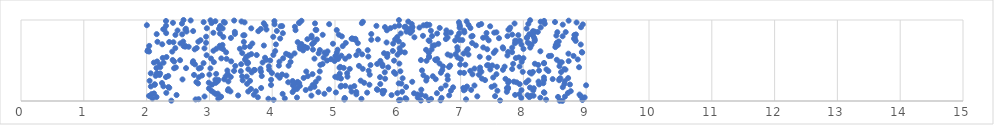
| Category | Series 0 |
|---|---|
| 8.620334740561397 | 0.001 |
| 8.577781063978271 | 0.003 |
| 2.394129611794839 | 0.004 |
| 6.367116884352891 | 0.006 |
| 7.628746824519194 | 0.007 |
| 6.680696197095411 | 0.008 |
| 6.0182350392369175 | 0.01 |
| 6.494375814497979 | 0.011 |
| 8.939752977108713 | 0.013 |
| 6.038626159554214 | 0.014 |
| 4.0221696450401705 | 0.015 |
| 8.36124268354945 | 0.017 |
| 5.149115118206559 | 0.018 |
| 2.780681563461558 | 0.02 |
| 7.086586834998346 | 0.021 |
| 2.82830336923716 | 0.022 |
| 6.135725208126665 | 0.024 |
| 6.529994858500692 | 0.025 |
| 5.421172009272322 | 0.026 |
| 3.9399875411051037 | 0.028 |
| 3.1417226934743816 | 0.029 |
| 2.0935191159519415 | 0.031 |
| 4.200688805081899 | 0.032 |
| 5.157020477372738 | 0.033 |
| 6.121508024751515 | 0.035 |
| 5.154020457620649 | 0.036 |
| 7.96602483923554 | 0.038 |
| 6.698022358880593 | 0.039 |
| 8.26959194742168 | 0.04 |
| 6.317431436418376 | 0.042 |
| 4.394443002276267 | 0.043 |
| 8.975484957480315 | 0.045 |
| 3.771585918920084 | 0.046 |
| 8.093873283273606 | 0.047 |
| 2.1581239671881383 | 0.049 |
| 8.551694796909633 | 0.05 |
| 3.1783726633881058 | 0.052 |
| 3.1855228534734934 | 0.053 |
| 8.661343083831905 | 0.054 |
| 2.9224018196007653 | 0.056 |
| 7.265581514534332 | 0.057 |
| 6.441491807775577 | 0.059 |
| 7.548647643515576 | 0.06 |
| 8.912007410644422 | 0.061 |
| 2.0382421870141894 | 0.063 |
| 8.12089670831112 | 0.064 |
| 8.161868215036687 | 0.066 |
| 4.624342285559006 | 0.067 |
| 3.4579888722409384 | 0.068 |
| 6.817817682467866 | 0.07 |
| 8.06594473842435 | 0.071 |
| 5.900421587838842 | 0.073 |
| 2.477007553058457 | 0.074 |
| 7.867908435245571 | 0.075 |
| 3.7076346270599654 | 0.077 |
| 6.371708374958117 | 0.078 |
| 8.893988422071315 | 0.079 |
| 6.314305421941711 | 0.081 |
| 5.339979780789223 | 0.082 |
| 7.935927694832709 | 0.084 |
| 2.080248321402492 | 0.085 |
| 3.102141303672091 | 0.086 |
| 4.166225096903844 | 0.088 |
| 4.831019658294338 | 0.089 |
| 3.1333976846445175 | 0.091 |
| 5.761507799481672 | 0.092 |
| 2.1185464060351173 | 0.093 |
| 6.25847755851577 | 0.095 |
| 6.622464147850438 | 0.096 |
| 5.992118365913914 | 0.098 |
| 8.709469036508903 | 0.099 |
| 2.31390816328849 | 0.1 |
| 8.334138534038694 | 0.102 |
| 5.511827417850529 | 0.103 |
| 3.067149837540377 | 0.105 |
| 5.014468910864612 | 0.106 |
| 8.326885987061788 | 0.107 |
| 4.7348156235051775 | 0.109 |
| 4.324954670473176 | 0.11 |
| 5.338746026796757 | 0.112 |
| 7.736128566430616 | 0.113 |
| 6.068847741583221 | 0.114 |
| 5.264342235443349 | 0.116 |
| 3.6180632176365313 | 0.117 |
| 3.33515913851461 | 0.119 |
| 3.7400972610486805 | 0.12 |
| 8.753925341187738 | 0.121 |
| 5.751686463864311 | 0.123 |
| 5.784313105735203 | 0.124 |
| 3.031973449589434 | 0.126 |
| 7.586048773269678 | 0.127 |
| 6.846116851391246 | 0.128 |
| 3.294668362935326 | 0.13 |
| 8.156151926477396 | 0.131 |
| 7.0515330906881255 | 0.132 |
| 7.969359191170405 | 0.134 |
| 4.533929907262074 | 0.135 |
| 7.168046548339563 | 0.137 |
| 5.675308210907399 | 0.138 |
| 6.374173429319274 | 0.139 |
| 4.353616781089704 | 0.141 |
| 7.068182818923401 | 0.142 |
| 4.904569993495854 | 0.144 |
| 5.667646251854268 | 0.145 |
| 3.301755577856441 | 0.146 |
| 3.661625587687106 | 0.148 |
| 4.395780241051994 | 0.149 |
| 7.755298526900773 | 0.151 |
| 4.359294629269337 | 0.152 |
| 6.688547719138859 | 0.153 |
| 2.992284067040303 | 0.155 |
| 4.608864252538719 | 0.156 |
| 8.165045972294058 | 0.158 |
| 7.736883620469168 | 0.159 |
| 3.824126002981173 | 0.16 |
| 7.043984929636865 | 0.162 |
| 2.3609790268477164 | 0.163 |
| 7.755250939481829 | 0.165 |
| 8.10440093037882 | 0.166 |
| 5.247088261994797 | 0.167 |
| 6.880652807361724 | 0.169 |
| 8.62681686267085 | 0.17 |
| 2.348155028301093 | 0.172 |
| 6.132225335017425 | 0.173 |
| 7.49388413491942 | 0.174 |
| 4.671837880973394 | 0.176 |
| 5.089523878336838 | 0.177 |
| 7.10144382525517 | 0.179 |
| 2.067397789355227 | 0.18 |
| 2.2679657403912676 | 0.181 |
| 4.665551521192633 | 0.183 |
| 5.307582962681378 | 0.184 |
| 4.439659909656607 | 0.185 |
| 5.163193394501674 | 0.187 |
| 5.0987165360337965 | 0.188 |
| 7.53992506310093 | 0.19 |
| 7.220708743274301 | 0.191 |
| 6.761642891512213 | 0.192 |
| 8.998310135500535 | 0.194 |
| 4.32847311676495 | 0.195 |
| 4.643649716206369 | 0.197 |
| 3.981324359384705 | 0.198 |
| 2.127982691667706 | 0.199 |
| 5.548304375840037 | 0.201 |
| 3.0434532756628583 | 0.202 |
| 8.74104309252086 | 0.204 |
| 8.251007837546165 | 0.205 |
| 2.1310251748720983 | 0.206 |
| 7.94144802617223 | 0.208 |
| 5.721280811588738 | 0.209 |
| 8.653722630080274 | 0.211 |
| 3.6003542244516824 | 0.212 |
| 4.37407635934352 | 0.213 |
| 6.056395641203517 | 0.215 |
| 2.819407067253628 | 0.216 |
| 6.014594385633039 | 0.218 |
| 8.317511186979411 | 0.219 |
| 4.429862278746077 | 0.22 |
| 2.245171579689807 | 0.222 |
| 3.0994218851231077 | 0.223 |
| 5.464113123875528 | 0.225 |
| 2.9898442183064367 | 0.226 |
| 7.756750798366252 | 0.227 |
| 8.042936577896054 | 0.229 |
| 7.893613061361598 | 0.23 |
| 4.255350412334257 | 0.232 |
| 2.7927124223012743 | 0.233 |
| 4.692966219793615 | 0.234 |
| 4.406285371015967 | 0.236 |
| 6.229664019301289 | 0.237 |
| 7.8487163905028305 | 0.238 |
| 8.241047454991406 | 0.24 |
| 3.301576266974131 | 0.241 |
| 3.1305462797666657 | 0.243 |
| 8.657782304960795 | 0.244 |
| 7.7673642906774525 | 0.245 |
| 4.325992628745898 | 0.247 |
| 3.646732672734283 | 0.248 |
| 2.0479323924500776 | 0.25 |
| 5.409477848767041 | 0.251 |
| 6.45336829436801 | 0.252 |
| 8.079477831281544 | 0.254 |
| 3.530016634358503 | 0.255 |
| 8.569569628891657 | 0.257 |
| 7.389718221654414 | 0.258 |
| 8.328198960639043 | 0.259 |
| 3.142097861045819 | 0.261 |
| 3.9822140932649375 | 0.262 |
| 3.0950273456595427 | 0.264 |
| 6.795297226545601 | 0.265 |
| 2.571533173613245 | 0.266 |
| 3.235690021085294 | 0.268 |
| 6.603680042797346 | 0.269 |
| 8.466812996970264 | 0.271 |
| 8.573147233176808 | 0.272 |
| 7.714591806620703 | 0.273 |
| 5.79811897905985 | 0.275 |
| 7.3395427082960065 | 0.276 |
| 5.09486512981708 | 0.278 |
| 4.739291857579742 | 0.279 |
| 6.076905409188501 | 0.28 |
| 8.588686329437465 | 0.282 |
| 8.712441523283601 | 0.283 |
| 4.501168894721407 | 0.285 |
| 6.463415149616182 | 0.286 |
| 4.1194688852757455 | 0.287 |
| 5.045087589869803 | 0.289 |
| 7.519504833309577 | 0.29 |
| 8.326988255419288 | 0.291 |
| 2.830762448349465 | 0.293 |
| 5.717085970194961 | 0.294 |
| 2.3085513192408076 | 0.296 |
| 3.34000165499681 | 0.297 |
| 5.004234574926601 | 0.298 |
| 5.1984226812590215 | 0.3 |
| 3.594150168755199 | 0.301 |
| 3.258439250257056 | 0.303 |
| 3.5216033574599983 | 0.304 |
| 6.557749552927165 | 0.305 |
| 4.5672798455573975 | 0.307 |
| 3.833489999593424 | 0.308 |
| 2.344848900731992 | 0.31 |
| 2.144281194732572 | 0.311 |
| 6.790992336447414 | 0.312 |
| 4.226133122997952 | 0.314 |
| 2.882722209854035 | 0.315 |
| 4.083648737790945 | 0.317 |
| 6.408275507408994 | 0.318 |
| 5.065569416685895 | 0.319 |
| 2.205155097834016 | 0.321 |
| 2.75529172518958 | 0.322 |
| 7.292103075053982 | 0.324 |
| 5.552659255794133 | 0.325 |
| 2.999659274692581 | 0.326 |
| 4.158145246237067 | 0.328 |
| 7.1894962357559855 | 0.329 |
| 7.570595830621945 | 0.331 |
| 4.642483412831448 | 0.332 |
| 3.2919753915087324 | 0.333 |
| 3.1078873156430644 | 0.335 |
| 5.9625259445807135 | 0.336 |
| 5.075850176349863 | 0.338 |
| 8.129263020818119 | 0.339 |
| 2.215595928039105 | 0.34 |
| 2.0661597143934785 | 0.342 |
| 5.193397973154988 | 0.343 |
| 2.164865517327838 | 0.344 |
| 3.995586978359274 | 0.346 |
| 7.054406683918627 | 0.347 |
| 6.68590934342507 | 0.349 |
| 6.991428618320853 | 0.35 |
| 8.101733729228194 | 0.351 |
| 3.673824181933775 | 0.353 |
| 5.7929338201949765 | 0.354 |
| 5.939522970302994 | 0.356 |
| 8.60008170739517 | 0.357 |
| 8.151392512686577 | 0.358 |
| 7.989449197010353 | 0.36 |
| 7.3309346650769225 | 0.361 |
| 3.82177528115448 | 0.363 |
| 4.542730236084017 | 0.364 |
| 4.756802381668503 | 0.365 |
| 6.040867127518111 | 0.367 |
| 3.500461901464748 | 0.368 |
| 8.397234639392773 | 0.37 |
| 3.392617332543344 | 0.371 |
| 7.153279141530445 | 0.372 |
| 5.535846188563598 | 0.374 |
| 8.24905426758135 | 0.375 |
| 3.2860847382399982 | 0.377 |
| 6.385288972781698 | 0.378 |
| 7.309659957949908 | 0.379 |
| 6.707571725050807 | 0.381 |
| 3.7232713546467013 | 0.382 |
| 3.7115269258937773 | 0.384 |
| 7.67417847365904 | 0.385 |
| 3.9523328175740566 | 0.386 |
| 8.670143864905558 | 0.388 |
| 7.473331782140614 | 0.389 |
| 8.36693882768353 | 0.391 |
| 3.6196793368350164 | 0.392 |
| 8.650897439677376 | 0.393 |
| 7.821093961717614 | 0.395 |
| 5.235193529566292 | 0.396 |
| 5.441131229159433 | 0.397 |
| 3.813357282411073 | 0.399 |
| 7.22142835089465 | 0.4 |
| 2.830489413809686 | 0.402 |
| 3.016333244331552 | 0.403 |
| 2.43784841906156 | 0.404 |
| 2.6280231165607115 | 0.406 |
| 2.156510685694267 | 0.407 |
| 5.139014908626514 | 0.409 |
| 2.8638014220249657 | 0.41 |
| 5.07198112860355 | 0.411 |
| 7.3095804317339725 | 0.413 |
| 2.4657731198375332 | 0.414 |
| 5.846926004705378 | 0.416 |
| 8.886562794754873 | 0.417 |
| 2.2181409892337864 | 0.418 |
| 6.814875930565524 | 0.42 |
| 5.0833876453680515 | 0.421 |
| 7.579200147718461 | 0.423 |
| 7.701047661365609 | 0.424 |
| 7.93980238241263 | 0.425 |
| 6.71959220051431 | 0.427 |
| 3.946820514564122 | 0.428 |
| 8.574382392047943 | 0.43 |
| 5.759200197191699 | 0.431 |
| 3.411928994337532 | 0.432 |
| 5.381697089754583 | 0.434 |
| 4.261139038706374 | 0.435 |
| 4.10651674643322 | 0.437 |
| 6.834021776822821 | 0.438 |
| 7.505466211165718 | 0.439 |
| 7.420941734698777 | 0.441 |
| 7.4418028055715535 | 0.442 |
| 5.565742842571682 | 0.444 |
| 8.23635223978123 | 0.445 |
| 4.766121340419551 | 0.446 |
| 7.075232237231541 | 0.448 |
| 2.208879257320607 | 0.449 |
| 6.992807875282049 | 0.45 |
| 2.7704339255194954 | 0.452 |
| 5.7527647148372045 | 0.453 |
| 3.5061474671538484 | 0.455 |
| 4.802144408149182 | 0.456 |
| 5.671517770989667 | 0.457 |
| 7.836659520290863 | 0.459 |
| 8.182452454275957 | 0.46 |
| 6.024653284208666 | 0.462 |
| 6.664421606138187 | 0.463 |
| 3.602075510609848 | 0.464 |
| 8.328405049224418 | 0.466 |
| 2.9071978230400575 | 0.467 |
| 8.328595351647499 | 0.469 |
| 3.6165562087665943 | 0.47 |
| 2.735884867114777 | 0.471 |
| 2.2696323362391824 | 0.473 |
| 2.1159801660951216 | 0.474 |
| 3.847193673911721 | 0.476 |
| 8.582521536721742 | 0.477 |
| 8.61028438327477 | 0.478 |
| 3.070897887551348 | 0.48 |
| 3.602891706441688 | 0.481 |
| 4.292402833027854 | 0.483 |
| 7.973121901519375 | 0.484 |
| 4.115281089768731 | 0.485 |
| 2.4395744478683903 | 0.487 |
| 2.1676866191789363 | 0.488 |
| 3.346632354920937 | 0.49 |
| 2.7408101245693124 | 0.491 |
| 8.72074942731579 | 0.492 |
| 4.994082923867589 | 0.494 |
| 5.72214922507919 | 0.495 |
| 6.457576631642732 | 0.497 |
| 5.940575088036761 | 0.498 |
| 4.873432118665203 | 0.499 |
| 3.968086188519889 | 0.501 |
| 6.608388214968276 | 0.502 |
| 2.5332461491486216 | 0.503 |
| 6.368554180297074 | 0.505 |
| 2.415434476558687 | 0.506 |
| 3.9054110917252096 | 0.508 |
| 8.53204312434594 | 0.509 |
| 6.595765832248066 | 0.51 |
| 3.566787590224805 | 0.512 |
| 8.86549235370561 | 0.513 |
| 7.004960717815031 | 0.515 |
| 4.936638010872729 | 0.516 |
| 6.627131799042346 | 0.517 |
| 5.049873636514673 | 0.519 |
| 3.273743213018228 | 0.52 |
| 5.163466157633952 | 0.522 |
| 4.6729326860424685 | 0.523 |
| 3.0261128975525082 | 0.524 |
| 3.189618704690272 | 0.526 |
| 4.17402495480843 | 0.527 |
| 8.000726734787708 | 0.529 |
| 7.8795218924240675 | 0.53 |
| 2.256426940738665 | 0.531 |
| 7.447168111192905 | 0.533 |
| 3.88590688832298 | 0.534 |
| 4.818364784772295 | 0.536 |
| 6.952833513952441 | 0.537 |
| 7.927894101946641 | 0.538 |
| 5.041587696906106 | 0.54 |
| 6.498221867893038 | 0.541 |
| 2.317160035859032 | 0.543 |
| 3.586968678692685 | 0.544 |
| 5.830791975489933 | 0.545 |
| 7.30544949212273 | 0.547 |
| 5.530318995785799 | 0.548 |
| 6.49656876086354 | 0.55 |
| 5.223367368774671 | 0.551 |
| 4.297562855897328 | 0.552 |
| 5.004914483470621 | 0.554 |
| 8.406204761878627 | 0.555 |
| 8.79850765151167 | 0.556 |
| 8.442039721589634 | 0.558 |
| 5.101264151773798 | 0.559 |
| 6.840581294807028 | 0.561 |
| 7.745540448128726 | 0.562 |
| 3.6257036395422255 | 0.563 |
| 2.9554171202997956 | 0.565 |
| 5.339260204436663 | 0.566 |
| 3.7534093143558804 | 0.568 |
| 4.018289299050387 | 0.569 |
| 4.26260085647373 | 0.57 |
| 5.995277176845484 | 0.572 |
| 7.1250101098579846 | 0.573 |
| 6.7940769732883695 | 0.575 |
| 5.432097270640233 | 0.576 |
| 6.919071567496458 | 0.577 |
| 3.6677627917965405 | 0.579 |
| 5.835922924267399 | 0.58 |
| 4.859896115484259 | 0.582 |
| 4.220874917527146 | 0.583 |
| 8.717118059456876 | 0.584 |
| 7.047559004467943 | 0.586 |
| 4.3554549584014906 | 0.587 |
| 4.740191050156976 | 0.589 |
| 5.781089690625247 | 0.59 |
| 3.522942489597081 | 0.591 |
| 6.494021190388336 | 0.593 |
| 7.528721523051351 | 0.594 |
| 5.028279489088819 | 0.596 |
| 4.832594922348788 | 0.597 |
| 8.936217029651798 | 0.598 |
| 6.111844133121123 | 0.6 |
| 3.2664700141912246 | 0.601 |
| 7.819850362732644 | 0.603 |
| 8.93092696451579 | 0.604 |
| 6.032758312096574 | 0.605 |
| 7.757301975327598 | 0.607 |
| 6.050432052953778 | 0.608 |
| 2.4086125044395867 | 0.609 |
| 2.0397705020580545 | 0.611 |
| 4.881174359578427 | 0.612 |
| 8.270374772805955 | 0.614 |
| 2.0132176975148552 | 0.615 |
| 4.047931500584588 | 0.616 |
| 5.92049562246393 | 0.618 |
| 5.375005612030904 | 0.619 |
| 3.0641547676183682 | 0.621 |
| 7.557069305402317 | 0.622 |
| 7.095832117320791 | 0.623 |
| 4.492182108738526 | 0.625 |
| 6.953274751822149 | 0.626 |
| 5.5207266124083585 | 0.628 |
| 4.758709338844849 | 0.629 |
| 2.0216069693834013 | 0.63 |
| 6.450042820929136 | 0.632 |
| 5.041797564120385 | 0.633 |
| 4.648817503088574 | 0.635 |
| 6.538337755879612 | 0.636 |
| 2.7657955061111443 | 0.637 |
| 7.424114417539711 | 0.639 |
| 7.114408178061046 | 0.64 |
| 3.216037189546134 | 0.642 |
| 8.001140923815335 | 0.643 |
| 3.485132599494773 | 0.644 |
| 3.112177790278171 | 0.646 |
| 4.44117323188779 | 0.647 |
| 7.67843202359275 | 0.649 |
| 2.921367759848135 | 0.65 |
| 6.028903871770585 | 0.651 |
| 2.456951922058102 | 0.653 |
| 2.797821334855784 | 0.654 |
| 4.557404981830404 | 0.656 |
| 3.179396966345871 | 0.657 |
| 7.821772165060807 | 0.658 |
| 8.10928864643247 | 0.66 |
| 7.3608418691822415 | 0.661 |
| 7.671135678099229 | 0.662 |
| 6.947264867246165 | 0.664 |
| 8.508790963733613 | 0.665 |
| 3.561140787907977 | 0.667 |
| 4.521273921207752 | 0.668 |
| 2.669705815771807 | 0.669 |
| 2.614545557104058 | 0.671 |
| 3.6445183413437015 | 0.672 |
| 4.492085754980582 | 0.674 |
| 4.437986091789058 | 0.675 |
| 2.59047346967086 | 0.676 |
| 5.123898994817316 | 0.678 |
| 2.6180083587783 | 0.679 |
| 2.0416567365469724 | 0.681 |
| 3.1653263392092152 | 0.682 |
| 6.555150092675697 | 0.683 |
| 3.8672690861524064 | 0.685 |
| 7.242694356063378 | 0.686 |
| 6.5851959620790685 | 0.688 |
| 8.547506516662072 | 0.689 |
| 8.51590564710159 | 0.69 |
| 3.2082726759109996 | 0.692 |
| 6.079140103496947 | 0.693 |
| 8.130368413470306 | 0.695 |
| 7.969439878705162 | 0.696 |
| 8.912976204171999 | 0.697 |
| 4.058979534214274 | 0.699 |
| 2.2492450285824965 | 0.7 |
| 4.637039239043579 | 0.702 |
| 4.465024996994946 | 0.703 |
| 8.099931919432104 | 0.704 |
| 6.645131278352737 | 0.706 |
| 4.967397258196218 | 0.707 |
| 5.926598521474202 | 0.709 |
| 3.6835368331012375 | 0.71 |
| 2.538995365143074 | 0.711 |
| 7.864547434722449 | 0.713 |
| 5.363120491766551 | 0.714 |
| 7.183981992679087 | 0.715 |
| 5.171472700451734 | 0.717 |
| 2.9469996800727802 | 0.718 |
| 8.532643969731936 | 0.72 |
| 8.069984905280377 | 0.721 |
| 5.821394454232086 | 0.722 |
| 4.668349619938729 | 0.724 |
| 2.426811877783058 | 0.725 |
| 4.406109673286762 | 0.727 |
| 2.360207785596277 | 0.728 |
| 3.548402368082099 | 0.729 |
| 2.1729562141224674 | 0.731 |
| 2.823809671333737 | 0.732 |
| 2.5828392887854825 | 0.734 |
| 8.56264549650351 | 0.735 |
| 6.016330851585096 | 0.736 |
| 7.905930096115096 | 0.738 |
| 6.5055755030239215 | 0.739 |
| 8.178223070114909 | 0.741 |
| 8.83268205957322 | 0.742 |
| 7.945596650763363 | 0.743 |
| 7.868950354173924 | 0.745 |
| 6.91335139364614 | 0.746 |
| 6.4910781641149855 | 0.748 |
| 7.446828196493758 | 0.749 |
| 2.8588713319890435 | 0.75 |
| 7.0274090385533885 | 0.752 |
| 6.982565362297861 | 0.753 |
| 5.324802028986651 | 0.755 |
| 5.577732441671509 | 0.756 |
| 8.18172513647779 | 0.757 |
| 5.957260736976041 | 0.759 |
| 4.711450512955066 | 0.76 |
| 5.681216934284025 | 0.762 |
| 4.560272220411965 | 0.763 |
| 6.76574329822141 | 0.764 |
| 5.299148471772202 | 0.766 |
| 5.324543100225512 | 0.767 |
| 5.264133286806974 | 0.768 |
| 8.805734284891283 | 0.77 |
| 4.126794982627998 | 0.771 |
| 5.27322178970531 | 0.773 |
| 8.819424610288355 | 0.774 |
| 7.611446298097402 | 0.775 |
| 8.055621013729416 | 0.777 |
| 3.3428406248313145 | 0.778 |
| 8.171767172516596 | 0.78 |
| 7.358295467488681 | 0.781 |
| 4.628704144454563 | 0.782 |
| 6.792879457608798 | 0.784 |
| 7.408762566238393 | 0.785 |
| 6.264794397786023 | 0.787 |
| 8.060377881683147 | 0.788 |
| 5.991286942484498 | 0.789 |
| 3.221173004745439 | 0.791 |
| 4.016815001945707 | 0.792 |
| 2.9479628926071992 | 0.794 |
| 6.949697348169929 | 0.795 |
| 7.171432202263439 | 0.796 |
| 5.109189851251335 | 0.798 |
| 8.624382120525574 | 0.799 |
| 7.746566593433311 | 0.801 |
| 6.545591471953709 | 0.802 |
| 7.1905640406473434 | 0.803 |
| 6.4008645774302835 | 0.805 |
| 4.626472592731577 | 0.806 |
| 8.524817357288153 | 0.808 |
| 8.15223584234438 | 0.809 |
| 3.5395302119161394 | 0.81 |
| 3.5581194494089816 | 0.812 |
| 7.9184570830492484 | 0.813 |
| 8.811786947555468 | 0.815 |
| 2.4591496447170904 | 0.816 |
| 4.8040113860299245 | 0.817 |
| 5.060247480578419 | 0.819 |
| 7.822291322488327 | 0.82 |
| 8.836079544580581 | 0.821 |
| 2.566358481988487 | 0.823 |
| 8.093829480220865 | 0.824 |
| 2.1605783318085483 | 0.826 |
| 5.577647320733817 | 0.827 |
| 3.406633760506575 | 0.828 |
| 6.770499622272244 | 0.83 |
| 3.1689666590004464 | 0.831 |
| 6.626464646058972 | 0.833 |
| 6.0462071184562065 | 0.834 |
| 6.977305276639762 | 0.835 |
| 4.169720544898137 | 0.837 |
| 2.311634858191831 | 0.838 |
| 7.412502907350352 | 0.84 |
| 6.199256525255209 | 0.841 |
| 3.063418592829806 | 0.842 |
| 7.535417715181711 | 0.844 |
| 6.844426136253555 | 0.845 |
| 7.060606492579285 | 0.847 |
| 7.570730471349578 | 0.848 |
| 8.540363120370849 | 0.849 |
| 8.673684702432132 | 0.851 |
| 8.229153187992353 | 0.852 |
| 3.4047467367063717 | 0.854 |
| 8.181805144586008 | 0.855 |
| 6.138523904105542 | 0.856 |
| 2.636290191725334 | 0.858 |
| 8.159721793064307 | 0.859 |
| 8.150505577555936 | 0.861 |
| 3.778801179020099 | 0.862 |
| 2.741177293020601 | 0.863 |
| 4.073916502742513 | 0.865 |
| 6.22782924093923 | 0.866 |
| 6.526697177275262 | 0.868 |
| 7.053091765224618 | 0.869 |
| 2.4929870282178728 | 0.87 |
| 6.774733085957094 | 0.872 |
| 5.826185126184674 | 0.873 |
| 4.371757663833308 | 0.874 |
| 5.027731054726962 | 0.876 |
| 4.702769610609707 | 0.877 |
| 4.69194972834115 | 0.879 |
| 2.617862072596478 | 0.88 |
| 7.762017962889688 | 0.881 |
| 3.908691209140197 | 0.883 |
| 7.77610815927679 | 0.884 |
| 2.265287282879872 | 0.886 |
| 2.282025842445179 | 0.887 |
| 6.168282082935791 | 0.888 |
| 3.818230089542571 | 0.89 |
| 3.1528891897229925 | 0.891 |
| 2.6256911963789085 | 0.893 |
| 8.050993857544386 | 0.894 |
| 3.2109626313744086 | 0.895 |
| 3.666345253489405 | 0.897 |
| 2.958888671107636 | 0.898 |
| 5.883987372235311 | 0.9 |
| 7.156637322392707 | 0.901 |
| 6.667697588517956 | 0.902 |
| 6.9845826848271875 | 0.904 |
| 7.789587457295031 | 0.905 |
| 6.344819417108031 | 0.907 |
| 8.275936948631532 | 0.908 |
| 6.231717780861974 | 0.909 |
| 8.916685259810851 | 0.911 |
| 5.795550066067282 | 0.912 |
| 6.108819942694531 | 0.914 |
| 6.2312555590161 | 0.915 |
| 4.36154592873457 | 0.916 |
| 6.121015995338478 | 0.918 |
| 5.952126008941763 | 0.919 |
| 6.989533132394845 | 0.921 |
| 7.470784828924243 | 0.922 |
| 4.1333509131676855 | 0.923 |
| 4.1587331730218295 | 0.925 |
| 3.1708896846466503 | 0.926 |
| 5.659599311272675 | 0.927 |
| 2.309246672189242 | 0.929 |
| 3.892423134164138 | 0.93 |
| 6.021257234398 | 0.932 |
| 6.457311903885425 | 0.933 |
| 6.409927921770604 | 0.934 |
| 2.003943322207121 | 0.936 |
| 7.291510543878534 | 0.937 |
| 7.12630139356979 | 0.939 |
| 6.502064384999334 | 0.94 |
| 6.984688093595079 | 0.941 |
| 8.626646469073375 | 0.943 |
| 6.463131521755312 | 0.944 |
| 8.946022908081872 | 0.946 |
| 4.036838601474241 | 0.947 |
| 4.907189816175914 | 0.948 |
| 7.328858958063731 | 0.95 |
| 6.221442096266346 | 0.951 |
| 8.078233932418485 | 0.953 |
| 8.33985983249065 | 0.954 |
| 2.5626918680571134 | 0.955 |
| 7.858939130715552 | 0.957 |
| 4.681506429461972 | 0.958 |
| 3.866124176919643 | 0.96 |
| 5.427557486730336 | 0.961 |
| 3.034944018017683 | 0.962 |
| 4.428610629864904 | 0.964 |
| 2.4199203718559676 | 0.965 |
| 3.2462307534716954 | 0.967 |
| 4.43342395533357 | 0.968 |
| 8.846625393118444 | 0.969 |
| 3.560345716304255 | 0.971 |
| 6.973515991407428 | 0.972 |
| 2.9081973612804166 | 0.974 |
| 8.503310570210104 | 0.975 |
| 3.2297367141388724 | 0.976 |
| 5.444183482354536 | 0.978 |
| 8.275054201263249 | 0.979 |
| 6.166771428911115 | 0.98 |
| 3.5114093214254574 | 0.982 |
| 7.096007576843755 | 0.983 |
| 3.0951401819032136 | 0.985 |
| 4.035200561875257 | 0.986 |
| 2.3089790492279993 | 0.987 |
| 8.329584734103856 | 0.989 |
| 4.466052094911737 | 0.99 |
| 8.720198346407456 | 0.992 |
| 3.3943742409649986 | 0.993 |
| 2.7018008175724226 | 0.994 |
| 3.0167956839895154 | 0.996 |
| 8.107404239844813 | 0.997 |
| 6.018456269237802 | 0.999 |
| 2.587862949565095 | 1 |